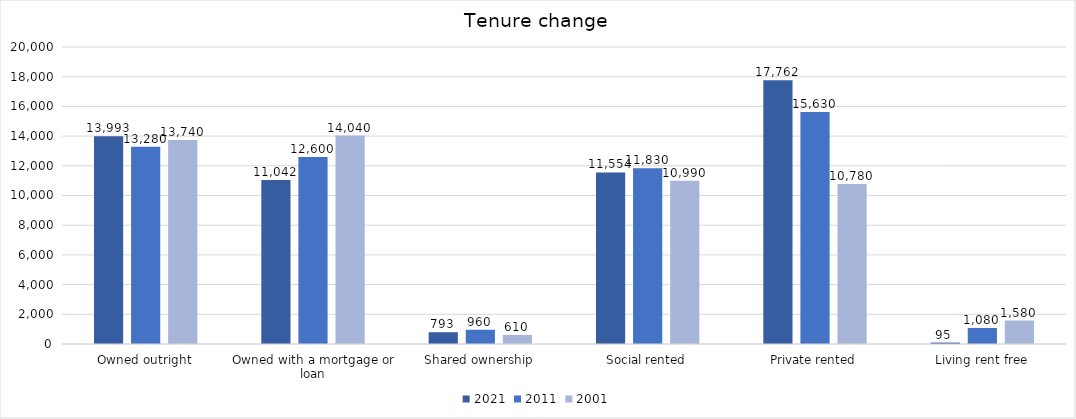
| Category | 2021 | 2011 | 2001 |
|---|---|---|---|
| Owned outright | 13993 | 13280 | 13740 |
| Owned with a mortgage or loan | 11042 | 12600 | 14040 |
| Shared ownership | 793 | 960 | 610 |
| Social rented | 11554 | 11830 | 10990 |
| Private rented | 17762 | 15630 | 10780 |
| Living rent free | 95 | 1080 | 1580 |